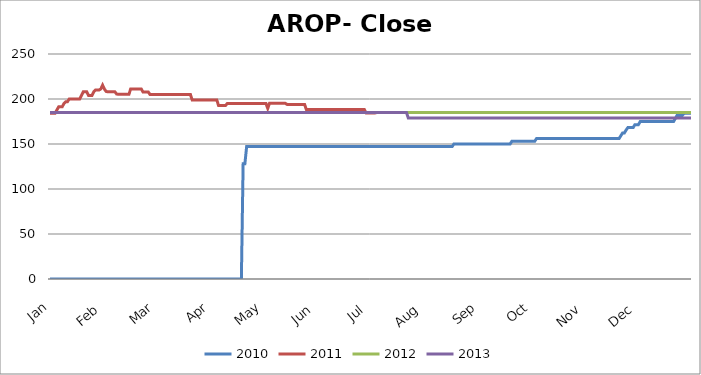
| Category | 2010 | 2011 | 2012 | 2013 |
|---|---|---|---|---|
| Jan | 0 | 184.23 | 184.902 | 184.9 |
|  | 0 | 184.23 | 184.902 | 184.9 |
|  | 0 | 184.23 | 184.902 | 184.9 |
|  | 0 | 184.23 | 184.902 | 184.9 |
|  | 0 | 187.858 | 184.902 | 184.9 |
|  | 0 | 191.266 | 184.902 | 184.9 |
|  | 0 | 191.266 | 184.902 | 184.9 |
|  | 0 | 191.266 | 184.902 | 184.9 |
|  | 0 | 195 | 184.902 | 184.9 |
|  | 0 | 197 | 184.902 | 184.9 |
|  | 0 | 197 | 184.902 | 184.9 |
|  | 0 | 200 | 184.902 | 184.9 |
|  | 0 | 200 | 184.902 | 184.9 |
|  | 0 | 200 | 184.902 | 184.9 |
|  | 0 | 200 | 184.902 | 184.9 |
|  | 0 | 200 | 184.902 | 184.9 |
|  | 0 | 200 | 184.902 | 184.9 |
|  | 0 | 200 | 184.902 | 184.9 |
|  | 0 | 204 | 184.902 | 184.9 |
|  | 0 | 208 | 184.902 | 184.9 |
|  | 0 | 208 | 184.902 | 184.9 |
|  | 0 | 208 | 184.902 | 184.9 |
|  | 0 | 204 | 184.902 | 184.9 |
|  | 0 | 204 | 184.902 | 184.9 |
|  | 0 | 204 | 184.902 | 184.9 |
|  | 0 | 208 | 184.902 | 184.9 |
|  | 0 | 210 | 184.902 | 184.9 |
|  | 0 | 210 | 184.902 | 184.9 |
|  | 0 | 210 | 184.902 | 184.9 |
|  | 0 | 211.218 | 184.902 | 184.9 |
|  | 0 | 215.4 | 184.902 | 184.9 |
| Feb | 0 | 211.2 | 184.902 | 184.9 |
|  | 0 | 208.4 | 184.902 | 184.9 |
|  | 0 | 208 | 184.902 | 184.9 |
|  | 0 | 208 | 184.902 | 184.9 |
|  | 0 | 208 | 184.902 | 184.9 |
|  | 0 | 208 | 184.902 | 184.9 |
|  | 0 | 208 | 184.902 | 184.9 |
|  | 0 | 205.5 | 184.902 | 184.9 |
|  | 0 | 205.288 | 184.902 | 184.9 |
|  | 0 | 205.288 | 184.902 | 184.9 |
|  | 0 | 205.288 | 184.902 | 184.9 |
|  | 0 | 205.288 | 184.902 | 184.9 |
|  | 0 | 205.288 | 184.902 | 184.9 |
|  | 0 | 205.288 | 184.902 | 184.9 |
|  | 0 | 205.288 | 184.902 | 184.9 |
|  | 0 | 211.2 | 184.902 | 184.9 |
|  | 0 | 211.2 | 184.902 | 184.9 |
|  | 0 | 211.2 | 184.902 | 184.9 |
|  | 0 | 211.2 | 184.902 | 184.9 |
|  | 0 | 211.2 | 184.902 | 184.9 |
|  | 0 | 211.2 | 184.902 | 184.9 |
|  | 0 | 211.2 | 184.902 | 184.9 |
|  | 0 | 207.846 | 184.902 | 184.9 |
|  | 0 | 207.846 | 184.902 | 184.9 |
|  | 0 | 207.846 | 184.902 | 184.9 |
|  | 0 | 207.846 | 184.902 | 184.9 |
|  | 0 | 205 | 184.902 | 184.9 |
|  | 0 | 205 | 184.902 | 184.9 |
|  | 0 | 205 | 184.902 | 184.9 |
| Mar | 0 | 205 | 184.902 | 184.9 |
|  | 0 | 205 | 184.902 | 184.9 |
|  | 0 | 205 | 184.902 | 184.9 |
|  | 0 | 205 | 184.902 | 184.9 |
|  | 0 | 205 | 184.902 | 184.9 |
|  | 0 | 205 | 184.902 | 184.9 |
|  | 0 | 205 | 184.902 | 184.9 |
|  | 0 | 205 | 184.902 | 184.9 |
|  | 0 | 205 | 184.902 | 184.9 |
|  | 0 | 205 | 184.902 | 184.9 |
|  | 0 | 205 | 184.902 | 184.9 |
|  | 0 | 205 | 184.902 | 184.9 |
|  | 0 | 205 | 184.902 | 184.9 |
|  | 0 | 205 | 184.902 | 184.9 |
|  | 0 | 205 | 184.902 | 184.9 |
|  | 0 | 205 | 184.902 | 184.9 |
|  | 0 | 205 | 184.902 | 184.9 |
|  | 0 | 205 | 184.902 | 184.9 |
|  | 0 | 205 | 184.902 | 184.9 |
|  | 0 | 205 | 184.902 | 184.9 |
|  | 0 | 205 | 184.902 | 184.9 |
|  | 0 | 198.9 | 184.902 | 184.9 |
|  | 0 | 198.9 | 184.902 | 184.9 |
|  | 0 | 198.9 | 184.902 | 184.9 |
|  | 0 | 198.9 | 184.902 | 184.9 |
|  | 0 | 198.9 | 184.902 | 184.9 |
|  | 0 | 198.9 | 184.902 | 184.9 |
|  | 0 | 198.9 | 184.902 | 184.9 |
|  | 0 | 198.9 | 184.902 | 184.9 |
|  | 0 | 198.9 | 184.902 | 184.9 |
|  | 0 | 198.9 | 184.902 | 184.9 |
| Apr | 0 | 198.9 | 184.902 | 184.9 |
|  | 0 | 198.9 | 184.902 | 184.9 |
|  | 0 | 198.9 | 184.902 | 184.9 |
|  | 0 | 198.9 | 184.902 | 184.9 |
|  | 0 | 198.9 | 184.902 | 184.9 |
|  | 0 | 192.9 | 184.902 | 184.9 |
|  | 0 | 192.9 | 184.902 | 184.9 |
|  | 0 | 192.9 | 184.902 | 184.9 |
|  | 0 | 192.9 | 184.902 | 184.9 |
|  | 0 | 192.9 | 184.902 | 184.9 |
|  | 0 | 195 | 184.902 | 184.9 |
|  | 0 | 195 | 184.902 | 184.9 |
|  | 0 | 195 | 184.902 | 184.9 |
|  | 0 | 195 | 184.902 | 184.9 |
|  | 0 | 195 | 184.902 | 184.9 |
|  | 0 | 195 | 184.902 | 184.9 |
|  | 0 | 195 | 184.902 | 184.9 |
|  | 0 | 195 | 184.902 | 184.9 |
|  | 0 | 195 | 184.902 | 184.9 |
|  | 128 | 195 | 184.902 | 184.9 |
|  | 128 | 195 | 184.902 | 184.9 |
|  | 147.2 | 195 | 184.902 | 184.9 |
|  | 147.2 | 195 | 184.902 | 184.9 |
|  | 147.2 | 195 | 184.902 | 184.9 |
|  | 147.2 | 195 | 184.902 | 184.9 |
|  | 147.2 | 195 | 184.902 | 184.9 |
|  | 147.2 | 195 | 184.902 | 184.9 |
|  | 147.2 | 195 | 184.902 | 184.9 |
|  | 147.2 | 195 | 184.902 | 184.9 |
|  | 147.2 | 195 | 184.902 | 184.9 |
| May | 147.2 | 195 | 184.902 | 184.9 |
|  | 147.2 | 195 | 184.902 | 184.9 |
|  | 147.2 | 195 | 184.902 | 184.9 |
|  | 147.2 | 189.58 | 184.902 | 184.9 |
|  | 147.2 | 195.2 | 184.902 | 184.9 |
|  | 147.2 | 195.2 | 184.902 | 184.9 |
|  | 147.2 | 195.2 | 184.902 | 184.9 |
|  | 147.2 | 195.2 | 184.902 | 184.9 |
|  | 147.2 | 195.2 | 184.902 | 184.9 |
|  | 147.2 | 195.2 | 184.902 | 184.9 |
|  | 147.2 | 195.2 | 184.902 | 184.9 |
|  | 147.2 | 195.2 | 184.902 | 184.9 |
|  | 147.2 | 195.2 | 184.902 | 184.9 |
|  | 147.2 | 195.2 | 184.902 | 184.9 |
|  | 147.2 | 194 | 184.902 | 184.9 |
|  | 147.2 | 194 | 184.902 | 184.9 |
|  | 147.2 | 194 | 184.902 | 184.9 |
|  | 147.2 | 194 | 184.902 | 184.9 |
|  | 147.2 | 194 | 184.902 | 184.9 |
|  | 147.2 | 194 | 184.902 | 184.9 |
|  | 147.2 | 194 | 184.902 | 184.9 |
|  | 147.2 | 194 | 184.902 | 184.9 |
|  | 147.2 | 194 | 184.902 | 184.9 |
|  | 147.2 | 194 | 184.902 | 184.9 |
|  | 147.2 | 194 | 184.902 | 184.9 |
|  | 147.2 | 188.2 | 184.902 | 184.9 |
|  | 147.2 | 188.2 | 184.902 | 184.9 |
|  | 147.2 | 188.2 | 184.902 | 184.9 |
|  | 147.2 | 188.2 | 184.902 | 184.9 |
|  | 147.2 | 188.2 | 184.902 | 184.9 |
|  | 147.2 | 188.2 | 184.902 | 184.9 |
| Jun | 147.2 | 188.2 | 184.902 | 184.9 |
|  | 147.2 | 188.2 | 184.902 | 184.9 |
|  | 147.2 | 188.2 | 184.902 | 184.9 |
|  | 147.2 | 188.2 | 184.902 | 184.9 |
|  | 147.2 | 188.2 | 184.902 | 184.9 |
|  | 147.2 | 188.2 | 184.902 | 184.9 |
|  | 147.2 | 188.2 | 184.902 | 184.9 |
|  | 147.2 | 188.2 | 184.902 | 184.9 |
|  | 147.2 | 188.2 | 184.902 | 184.9 |
|  | 147.2 | 188.2 | 184.902 | 184.9 |
|  | 147.2 | 188.2 | 184.9 | 184.9 |
|  | 147.2 | 188.2 | 184.9 | 184.9 |
|  | 147.2 | 188.2 | 184.9 | 184.9 |
|  | 147.2 | 188.2 | 184.9 | 184.9 |
|  | 147.2 | 188.2 | 184.9 | 184.9 |
|  | 147.2 | 188.2 | 184.9 | 184.9 |
|  | 147.2 | 188.2 | 184.9 | 184.9 |
|  | 147.2 | 188.2 | 184.9 | 184.9 |
|  | 147.2 | 188.2 | 184.9 | 184.9 |
|  | 147.2 | 188.2 | 184.9 | 184.9 |
|  | 147.2 | 188.2 | 184.9 | 184.9 |
|  | 147.2 | 188.2 | 184.9 | 184.9 |
|  | 147.2 | 188.2 | 184.9 | 184.9 |
|  | 147.2 | 188.2 | 184.9 | 184.9 |
|  | 147.2 | 188.2 | 184.9 | 184.9 |
|  | 147.2 | 188.2 | 184.9 | 184.9 |
|  | 147.2 | 188.2 | 184.9 | 184.9 |
|  | 147.2 | 188.2 | 184.9 | 184.9 |
|  | 147.2 | 184.5 | 184.9 | 184.9 |
|  | 147.2 | 184.5 | 184.9 | 184.9 |
| Jul | 147.2 | 184.5 | 184.9 | 184.9 |
|  | 147.2 | 184.5 | 184.9 | 184.9 |
|  | 147.2 | 184.5 | 184.9 | 184.9 |
|  | 147.2 | 184.5 | 184.9 | 184.9 |
|  | 147.2 | 184.902 | 184.9 | 184.9 |
|  | 147.2 | 184.902 | 184.9 | 184.9 |
|  | 147.2 | 184.902 | 184.9 | 184.9 |
|  | 147.2 | 184.902 | 184.9 | 184.9 |
|  | 147.2 | 184.902 | 184.9 | 184.9 |
|  | 147.2 | 184.902 | 184.9 | 184.9 |
|  | 147.2 | 184.902 | 184.9 | 184.9 |
|  | 147.2 | 184.902 | 184.9 | 184.9 |
|  | 147.2 | 184.902 | 184.9 | 184.9 |
|  | 147.2 | 184.902 | 184.9 | 184.9 |
|  | 147.2 | 184.902 | 184.9 | 184.9 |
|  | 147.2 | 184.902 | 184.9 | 184.9 |
|  | 147.2 | 184.902 | 184.9 | 184.9 |
|  | 147.2 | 184.902 | 184.9 | 184.9 |
|  | 147.2 | 184.902 | 184.9 | 184.9 |
|  | 147.2 | 184.902 | 184.9 | 184.9 |
|  | 147.2 | 184.902 | 184.9 | 184.9 |
|  | 147.2 | 184.902 | 184.9 | 184.9 |
|  | 147.2 | 184.902 | 184.9 | 178.9 |
|  | 147.2 | 184.902 | 184.9 | 178.9 |
|  | 147.2 | 184.902 | 184.9 | 178.9 |
|  | 147.2 | 184.902 | 184.9 | 178.9 |
|  | 147.2 | 184.902 | 184.9 | 178.9 |
|  | 147.2 | 184.902 | 184.9 | 178.9 |
|  | 147.2 | 184.902 | 184.9 | 178.9 |
|  | 147.2 | 184.902 | 184.9 | 178.9 |
|  | 147.2 | 184.902 | 184.9 | 178.9 |
| Aug | 147.2 | 184.902 | 184.9 | 178.9 |
|  | 147.2 | 184.902 | 184.9 | 178.9 |
|  | 147.2 | 184.902 | 184.9 | 178.9 |
|  | 147.2 | 184.902 | 184.9 | 178.9 |
|  | 147.2 | 184.902 | 184.9 | 178.9 |
|  | 147.2 | 184.902 | 184.9 | 178.9 |
|  | 147.2 | 184.902 | 184.9 | 178.9 |
|  | 147.2 | 184.902 | 184.9 | 178.9 |
|  | 147.2 | 184.902 | 184.9 | 178.9 |
|  | 147.2 | 184.902 | 184.9 | 178.9 |
|  | 147.2 | 184.902 | 184.9 | 178.9 |
|  | 147.2 | 184.902 | 184.9 | 178.9 |
|  | 147.2 | 184.902 | 184.9 | 178.9 |
|  | 147.2 | 184.902 | 184.9 | 178.9 |
|  | 147.2 | 184.902 | 184.9 | 178.9 |
|  | 147.2 | 184.902 | 184.9 | 178.9 |
|  | 147.2 | 184.902 | 184.9 | 178.9 |
|  | 150.1 | 184.902 | 184.9 | 178.9 |
|  | 150.1 | 184.902 | 184.9 | 178.9 |
|  | 150.1 | 184.902 | 184.9 | 178.9 |
|  | 150.1 | 184.902 | 184.9 | 178.9 |
|  | 150.1 | 184.902 | 184.9 | 178.9 |
|  | 150.1 | 184.902 | 184.9 | 178.9 |
|  | 150.1 | 184.902 | 184.9 | 178.9 |
|  | 150.1 | 184.902 | 184.9 | 178.9 |
|  | 150.1 | 184.902 | 184.9 | 178.9 |
|  | 150.1 | 184.902 | 184.9 | 178.9 |
|  | 150.1 | 184.902 | 184.9 | 178.9 |
|  | 150.1 | 184.902 | 184.9 | 178.9 |
|  | 150.1 | 184.902 | 184.9 | 178.9 |
|  | 150.1 | 184.902 | 184.9 | 178.9 |
| Sep | 150.1 | 184.902 | 184.9 | 178.9 |
|  | 150.1 | 184.902 | 184.9 | 178.9 |
|  | 150.1 | 184.902 | 184.9 | 178.9 |
|  | 150.1 | 184.902 | 184.9 | 178.9 |
|  | 150.1 | 184.902 | 184.9 | 178.9 |
|  | 150.1 | 184.902 | 184.9 | 178.9 |
|  | 150.1 | 184.902 | 184.9 | 178.9 |
|  | 150.1 | 184.902 | 184.9 | 178.9 |
|  | 150.1 | 184.902 | 184.9 | 178.9 |
|  | 150.1 | 184.902 | 184.9 | 178.9 |
|  | 150.1 | 184.902 | 184.9 | 178.9 |
|  | 150.1 | 184.902 | 184.9 | 178.9 |
|  | 150.1 | 184.902 | 184.9 | 178.9 |
|  | 150.1 | 184.902 | 184.9 | 178.9 |
|  | 150.1 | 184.902 | 184.9 | 178.9 |
|  | 150.1 | 184.902 | 184.9 | 178.9 |
|  | 150.1 | 184.902 | 184.9 | 178.9 |
|  | 150.1 | 184.902 | 184.9 | 178.9 |
|  | 150.1 | 184.902 | 184.9 | 178.9 |
|  | 153.1 | 184.902 | 184.9 | 178.9 |
|  | 153.1 | 184.902 | 184.9 | 178.9 |
|  | 153.1 | 184.902 | 184.9 | 178.9 |
|  | 153.1 | 184.902 | 184.9 | 178.9 |
|  | 153.1 | 184.902 | 184.9 | 178.9 |
|  | 153.1 | 184.902 | 184.9 | 178.9 |
|  | 153.1 | 184.902 | 184.9 | 178.9 |
|  | 153.1 | 184.902 | 184.9 | 178.9 |
|  | 153.1 | 184.902 | 184.9 | 178.9 |
|  | 153.1 | 184.902 | 184.9 | 178.9 |
|  | 153.1 | 184.902 | 184.9 | 178.9 |
| Oct | 153.1 | 184.902 | 184.9 | 178.9 |
|  | 153.1 | 184.902 | 184.9 | 178.9 |
|  | 153.1 | 184.902 | 184.9 | 178.9 |
|  | 156.1 | 184.902 | 184.9 | 178.9 |
|  | 156.1 | 184.902 | 184.9 | 178.9 |
|  | 156.1 | 184.902 | 184.9 | 178.9 |
|  | 156.1 | 184.902 | 184.9 | 178.9 |
|  | 156.1 | 184.902 | 184.9 | 178.9 |
|  | 156.1 | 184.902 | 184.9 | 178.9 |
|  | 156.1 | 184.902 | 184.9 | 178.9 |
|  | 156.1 | 184.902 | 184.9 | 178.9 |
|  | 156.1 | 184.902 | 184.9 | 178.9 |
|  | 156.1 | 184.902 | 184.9 | 178.9 |
|  | 156.1 | 184.902 | 184.9 | 178.9 |
|  | 156.1 | 184.902 | 184.9 | 178.9 |
|  | 156.1 | 184.902 | 184.9 | 178.9 |
|  | 156.1 | 184.902 | 184.9 | 178.9 |
|  | 156.1 | 184.902 | 184.9 | 178.9 |
|  | 156.1 | 184.902 | 184.9 | 178.9 |
|  | 156.1 | 184.902 | 184.9 | 178.9 |
|  | 156.1 | 184.902 | 184.9 | 178.9 |
|  | 156.1 | 184.902 | 184.9 | 178.9 |
|  | 156.1 | 184.902 | 184.9 | 178.9 |
|  | 156.1 | 184.902 | 184.9 | 178.9 |
|  | 156.1 | 184.902 | 184.9 | 178.9 |
|  | 156.1 | 184.902 | 184.9 | 178.9 |
|  | 156.1 | 184.902 | 184.9 | 178.9 |
|  | 156.1 | 184.902 | 184.9 | 178.9 |
|  | 156.1 | 184.902 | 184.9 | 178.9 |
|  | 156.1 | 184.902 | 184.9 | 178.9 |
|  | 156.1 | 184.902 | 184.9 | 178.9 |
| Nov | 156.1 | 184.902 | 184.9 | 178.9 |
|  | 156.1 | 184.902 | 184.9 | 178.9 |
|  | 156.1 | 184.902 | 184.9 | 178.9 |
|  | 156.1 | 184.902 | 184.9 | 178.9 |
|  | 156.1 | 184.902 | 184.9 | 178.9 |
|  | 156.1 | 184.902 | 184.9 | 178.9 |
|  | 156.1 | 184.902 | 184.9 | 178.9 |
|  | 156.1 | 184.902 | 184.9 | 178.9 |
|  | 156.1 | 184.902 | 184.9 | 178.9 |
|  | 156.1 | 184.902 | 184.9 | 178.9 |
|  | 156.1 | 184.902 | 184.9 | 178.9 |
|  | 156.1 | 184.902 | 184.9 | 178.9 |
|  | 156.1 | 184.902 | 184.9 | 178.9 |
|  | 156.1 | 184.902 | 184.9 | 178.9 |
|  | 156.1 | 184.902 | 184.9 | 178.9 |
|  | 156.1 | 184.902 | 184.9 | 178.9 |
|  | 156.1 | 184.902 | 184.9 | 178.9 |
|  | 156.1 | 184.902 | 184.9 | 178.9 |
|  | 156.1 | 184.902 | 184.9 | 178.9 |
|  | 156.1 | 184.902 | 184.9 | 178.9 |
|  | 159.2 | 184.902 | 184.9 | 178.9 |
|  | 162.3 | 184.902 | 184.9 | 178.9 |
|  | 162.3 | 184.902 | 184.9 | 178.9 |
|  | 165.5 | 184.902 | 184.9 | 178.9 |
|  | 168.22 | 184.902 | 184.9 | 178.9 |
|  | 168.22 | 184.902 | 184.9 | 178.9 |
|  | 168.22 | 184.902 | 184.9 | 178.9 |
|  | 168.22 | 184.902 | 184.9 | 178.9 |
|  | 171.5 | 184.902 | 184.9 | 178.9 |
|  | 171.5 | 184.902 | 184.9 | 178.9 |
| Dec | 171.5 | 184.902 | 184.9 | 178.9 |